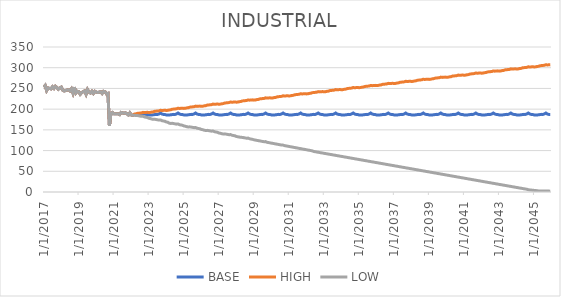
| Category | BASE | HIGH | LOW |
|---|---|---|---|
| 1/1/17 | 253 | 253 | 253 |
| 2/1/17 | 257 | 257 | 257 |
| 3/1/17 | 245 | 245 | 245 |
| 4/1/17 | 251 | 251 | 251 |
| 5/1/17 | 250 | 250 | 250 |
| 6/1/17 | 249 | 249 | 249 |
| 7/1/17 | 254 | 254 | 254 |
| 8/1/17 | 250 | 250 | 250 |
| 9/1/17 | 255 | 255 | 255 |
| 10/1/17 | 252 | 252 | 252 |
| 11/1/17 | 248 | 248 | 248 |
| 12/1/17 | 251 | 251 | 251 |
| 1/1/18 | 253 | 253 | 253 |
| 2/1/18 | 246 | 246 | 246 |
| 3/1/18 | 244 | 244 | 244 |
| 4/1/18 | 245 | 245 | 245 |
| 5/1/18 | 246 | 246 | 246 |
| 6/1/18 | 247 | 247 | 247 |
| 7/1/18 | 244 | 244 | 244 |
| 8/1/18 | 249 | 249 | 249 |
| 9/1/18 | 239 | 239 | 239 |
| 10/1/18 | 253 | 253 | 253 |
| 11/1/18 | 239 | 239 | 239 |
| 12/1/18 | 243.091 | 243.091 | 243.091 |
| 1/1/19 | 242 | 242 | 242 |
| 2/1/19 | 236 | 236 | 236 |
| 3/1/19 | 240 | 240 | 240 |
| 4/1/19 | 242 | 242 | 242 |
| 5/1/19 | 244 | 244 | 244 |
| 6/1/19 | 236 | 236 | 236 |
| 7/1/19 | 247 | 247 | 247 |
| 8/1/19 | 241 | 241 | 241 |
| 9/1/19 | 239 | 239 | 239 |
| 10/1/19 | 243 | 243 | 243 |
| 11/1/19 | 238 | 238 | 238 |
| 12/1/19 | 243 | 243 | 243 |
| 1/1/20 | 241 | 241 | 241 |
| 2/1/20 | 240 | 240 | 240 |
| 3/1/20 | 241 | 241 | 241 |
| 4/1/20 | 242 | 242 | 242 |
| 5/1/20 | 238 | 238 | 238 |
| 6/1/20 | 243 | 243 | 243 |
| 7/1/20 | 242 | 242 | 242 |
| 8/1/20 | 237 | 237 | 237 |
| 9/1/20 | 238 | 238 | 238 |
| 10/1/20 | 160 | 160 | 160 |
| 11/1/20 | 190 | 190 | 190 |
| 12/1/20 | 192 | 192 | 192 |
| 1/1/21 | 189 | 189 | 189 |
| 2/1/21 | 189 | 189 | 189 |
| 3/1/21 | 189 | 189 | 189 |
| 4/1/21 | 189 | 189 | 189 |
| 5/1/21 | 187 | 187 | 187 |
| 6/1/21 | 192 | 192 | 192 |
| 7/1/21 | 191 | 191 | 191 |
| 8/1/21 | 190 | 190 | 190 |
| 9/1/21 | 191 | 191 | 191 |
| 10/1/21 | 189 | 189 | 189 |
| 11/1/21 | 186 | 186 | 186 |
| 12/1/21 | 191 | 191 | 191 |
| 1/1/22 | 186 | 186 | 186 |
| 2/1/22 | 185 | 185 | 185 |
| 3/1/22 | 186.764 | 188.014 | 185.097 |
| 4/1/22 | 186.859 | 188.389 | 184.389 |
| 5/1/22 | 186.943 | 189.764 | 184.681 |
| 6/1/22 | 187.372 | 190.139 | 183.972 |
| 7/1/22 | 186.653 | 190.514 | 183.264 |
| 8/1/22 | 188.143 | 190.889 | 182.556 |
| 9/1/22 | 190.713 | 192.264 | 182.847 |
| 10/1/22 | 188.242 | 191.639 | 181.139 |
| 11/1/22 | 187.274 | 192.014 | 180.431 |
| 12/1/22 | 187.211 | 192.389 | 179.722 |
| 1/1/23 | 186.11 | 191.764 | 178.014 |
| 2/1/23 | 186.002 | 192.139 | 177.306 |
| 3/1/23 | 185.862 | 193.014 | 176.097 |
| 4/1/23 | 186.339 | 193.389 | 175.389 |
| 5/1/23 | 186.837 | 194.764 | 175.681 |
| 6/1/23 | 187.345 | 195.139 | 174.972 |
| 7/1/23 | 187.225 | 195.514 | 174.264 |
| 8/1/23 | 188.499 | 195.889 | 173.556 |
| 9/1/23 | 190.638 | 197.264 | 173.847 |
| 10/1/23 | 188.269 | 196.639 | 172.139 |
| 11/1/23 | 187.278 | 197.014 | 171.431 |
| 12/1/23 | 187.029 | 197.389 | 170.722 |
| 1/1/24 | 186.012 | 196.764 | 169.014 |
| 2/1/24 | 185.937 | 197.139 | 168.306 |
| 3/1/24 | 185.869 | 198.014 | 166.139 |
| 4/1/24 | 186.372 | 198.389 | 165.472 |
| 5/1/24 | 186.876 | 199.764 | 165.806 |
| 6/1/24 | 187.379 | 200.139 | 165.139 |
| 7/1/24 | 187.256 | 200.514 | 164.472 |
| 8/1/24 | 188.508 | 200.889 | 163.806 |
| 9/1/24 | 190.634 | 202.264 | 164.139 |
| 10/1/24 | 188.259 | 201.639 | 162.472 |
| 11/1/24 | 187.258 | 202.014 | 161.806 |
| 12/1/24 | 187.006 | 202.389 | 161.139 |
| 1/1/25 | 186.004 | 201.764 | 159.472 |
| 2/1/25 | 185.941 | 202.139 | 158.806 |
| 3/1/25 | 185.879 | 203.014 | 157.639 |
| 4/1/25 | 186.38 | 203.389 | 156.972 |
| 5/1/25 | 186.881 | 204.764 | 157.306 |
| 6/1/25 | 187.381 | 205.139 | 156.639 |
| 7/1/25 | 187.256 | 205.514 | 155.972 |
| 8/1/25 | 188.506 | 205.889 | 155.306 |
| 9/1/25 | 190.631 | 207.264 | 155.639 |
| 10/1/25 | 188.256 | 206.639 | 153.972 |
| 11/1/25 | 187.256 | 207.014 | 153.306 |
| 12/1/25 | 187.006 | 207.389 | 152.639 |
| 1/1/26 | 186.005 | 206.764 | 150.972 |
| 2/1/26 | 185.943 | 207.139 | 150.306 |
| 3/1/26 | 185.881 | 208.014 | 149.139 |
| 4/1/26 | 186.381 | 208.389 | 148.472 |
| 5/1/26 | 186.881 | 209.764 | 148.806 |
| 6/1/26 | 187.381 | 210.139 | 148.139 |
| 7/1/26 | 187.256 | 210.514 | 147.472 |
| 8/1/26 | 188.506 | 210.889 | 146.806 |
| 9/1/26 | 190.631 | 212.264 | 147.139 |
| 10/1/26 | 188.256 | 211.639 | 145.472 |
| 11/1/26 | 187.256 | 212.014 | 144.806 |
| 12/1/26 | 187.006 | 212.389 | 144.139 |
| 1/1/27 | 186.006 | 211.764 | 142.472 |
| 2/1/27 | 185.943 | 212.139 | 141.806 |
| 3/1/27 | 185.881 | 213.014 | 140.639 |
| 4/1/27 | 186.381 | 213.389 | 139.972 |
| 5/1/27 | 186.881 | 214.764 | 140.306 |
| 6/1/27 | 187.381 | 215.139 | 139.639 |
| 7/1/27 | 187.256 | 215.514 | 138.972 |
| 8/1/27 | 188.506 | 215.889 | 138.306 |
| 9/1/27 | 190.631 | 217.264 | 138.639 |
| 10/1/27 | 188.256 | 216.639 | 136.972 |
| 11/1/27 | 187.256 | 217.014 | 136.306 |
| 12/1/27 | 187.006 | 217.389 | 135.639 |
| 1/1/28 | 186.006 | 216.764 | 133.972 |
| 2/1/28 | 185.943 | 217.139 | 133.306 |
| 3/1/28 | 185.881 | 218.014 | 132.639 |
| 4/1/28 | 186.381 | 218.389 | 131.972 |
| 5/1/28 | 186.881 | 219.764 | 131.806 |
| 6/1/28 | 187.381 | 220.139 | 131.139 |
| 7/1/28 | 187.256 | 220.514 | 130.472 |
| 8/1/28 | 188.506 | 220.889 | 129.806 |
| 9/1/28 | 190.631 | 222.264 | 130.139 |
| 10/1/28 | 188.256 | 221.639 | 128.472 |
| 11/1/28 | 187.256 | 222.014 | 127.806 |
| 12/1/28 | 187.006 | 222.389 | 127.139 |
| 1/1/29 | 186.006 | 221.764 | 125.972 |
| 2/1/29 | 185.943 | 222.139 | 125.306 |
| 3/1/29 | 185.881 | 223.014 | 124.639 |
| 4/1/29 | 186.381 | 223.389 | 123.972 |
| 5/1/29 | 186.881 | 224.764 | 123.306 |
| 6/1/29 | 187.381 | 225.139 | 122.639 |
| 7/1/29 | 187.256 | 225.514 | 121.972 |
| 8/1/29 | 188.506 | 225.889 | 121.306 |
| 9/1/29 | 190.631 | 227.264 | 121.639 |
| 10/1/29 | 188.256 | 226.639 | 119.972 |
| 11/1/29 | 187.256 | 227.014 | 119.306 |
| 12/1/29 | 187.006 | 227.389 | 118.639 |
| 1/1/30 | 186.006 | 226.764 | 117.972 |
| 2/1/30 | 185.943 | 227.139 | 117.306 |
| 3/1/30 | 185.881 | 228.014 | 116.639 |
| 4/1/30 | 186.381 | 228.389 | 115.972 |
| 5/1/30 | 186.881 | 229.764 | 115.306 |
| 6/1/30 | 187.381 | 230.139 | 114.639 |
| 7/1/30 | 187.256 | 230.514 | 113.972 |
| 8/1/30 | 188.506 | 230.889 | 113.306 |
| 9/1/30 | 190.631 | 232.264 | 113.139 |
| 10/1/30 | 188.256 | 231.639 | 111.972 |
| 11/1/30 | 187.256 | 232.014 | 111.306 |
| 12/1/30 | 187.006 | 232.389 | 110.639 |
| 1/1/31 | 186.006 | 231.764 | 109.972 |
| 2/1/31 | 185.943 | 232.139 | 109.306 |
| 3/1/31 | 185.881 | 233.014 | 108.639 |
| 4/1/31 | 186.381 | 233.389 | 107.972 |
| 5/1/31 | 186.881 | 234.764 | 107.306 |
| 6/1/31 | 187.381 | 235.139 | 106.639 |
| 7/1/31 | 187.256 | 235.514 | 105.972 |
| 8/1/31 | 188.506 | 235.889 | 105.306 |
| 9/1/31 | 190.631 | 237.264 | 104.639 |
| 10/1/31 | 188.256 | 236.639 | 103.972 |
| 11/1/31 | 187.256 | 237.014 | 103.306 |
| 12/1/31 | 187.006 | 237.389 | 102.639 |
| 1/1/32 | 186.006 | 236.764 | 101.972 |
| 2/1/32 | 185.943 | 237.139 | 101.306 |
| 3/1/32 | 185.881 | 238.014 | 100.639 |
| 4/1/32 | 186.381 | 238.389 | 99.972 |
| 5/1/32 | 186.881 | 239.764 | 99.306 |
| 6/1/32 | 187.381 | 240.139 | 97.806 |
| 7/1/32 | 187.256 | 240.514 | 97.181 |
| 8/1/32 | 188.506 | 240.889 | 96.556 |
| 9/1/32 | 190.631 | 242.264 | 95.931 |
| 10/1/32 | 188.256 | 241.639 | 95.306 |
| 11/1/32 | 187.256 | 242.014 | 94.681 |
| 12/1/32 | 187.006 | 242.389 | 94.056 |
| 1/1/33 | 186.006 | 241.764 | 93.431 |
| 2/1/33 | 185.943 | 242.139 | 92.806 |
| 3/1/33 | 185.881 | 243.014 | 92.181 |
| 4/1/33 | 186.381 | 243.389 | 91.556 |
| 5/1/33 | 186.881 | 244.764 | 90.931 |
| 6/1/33 | 187.381 | 245.139 | 90.306 |
| 7/1/33 | 187.256 | 245.514 | 89.681 |
| 8/1/33 | 188.506 | 245.889 | 89.056 |
| 9/1/33 | 190.631 | 247.264 | 88.431 |
| 10/1/33 | 188.256 | 246.639 | 87.806 |
| 11/1/33 | 187.256 | 247.014 | 87.181 |
| 12/1/33 | 187.006 | 247.389 | 86.556 |
| 1/1/34 | 186.006 | 246.764 | 85.931 |
| 2/1/34 | 185.943 | 247.139 | 85.306 |
| 3/1/34 | 185.881 | 248.014 | 84.681 |
| 4/1/34 | 186.381 | 248.389 | 84.056 |
| 5/1/34 | 186.881 | 249.764 | 83.431 |
| 6/1/34 | 187.381 | 250.139 | 82.806 |
| 7/1/34 | 187.256 | 250.514 | 82.181 |
| 8/1/34 | 188.506 | 250.889 | 81.556 |
| 9/1/34 | 190.631 | 252.264 | 80.931 |
| 10/1/34 | 188.256 | 251.639 | 80.306 |
| 11/1/34 | 187.256 | 252.014 | 79.681 |
| 12/1/34 | 187.006 | 252.389 | 79.056 |
| 1/1/35 | 186.006 | 251.764 | 78.431 |
| 2/1/35 | 185.943 | 252.139 | 77.806 |
| 3/1/35 | 185.881 | 253.014 | 77.181 |
| 4/1/35 | 186.381 | 253.389 | 76.556 |
| 5/1/35 | 186.881 | 254.764 | 75.931 |
| 6/1/35 | 187.381 | 255.139 | 75.306 |
| 7/1/35 | 187.256 | 255.514 | 74.681 |
| 8/1/35 | 188.506 | 255.889 | 74.056 |
| 9/1/35 | 190.631 | 257.264 | 73.431 |
| 10/1/35 | 188.256 | 256.639 | 72.806 |
| 11/1/35 | 187.256 | 257.014 | 72.181 |
| 12/1/35 | 187.006 | 257.389 | 71.556 |
| 1/1/36 | 186.006 | 256.764 | 70.931 |
| 2/1/36 | 185.943 | 257.139 | 70.306 |
| 3/1/36 | 185.881 | 258.014 | 69.681 |
| 4/1/36 | 186.381 | 258.389 | 69.056 |
| 5/1/36 | 186.881 | 259.764 | 68.431 |
| 6/1/36 | 187.381 | 260.139 | 67.806 |
| 7/1/36 | 187.256 | 260.514 | 67.181 |
| 8/1/36 | 188.506 | 260.889 | 66.556 |
| 9/1/36 | 190.631 | 262.264 | 65.931 |
| 10/1/36 | 188.256 | 261.639 | 65.306 |
| 11/1/36 | 187.256 | 262.014 | 64.681 |
| 12/1/36 | 187.006 | 262.389 | 64.056 |
| 1/1/37 | 186.006 | 261.764 | 63.431 |
| 2/1/37 | 185.943 | 262.139 | 62.806 |
| 3/1/37 | 185.881 | 263.014 | 62.181 |
| 4/1/37 | 186.381 | 263.389 | 61.556 |
| 5/1/37 | 186.881 | 264.764 | 60.931 |
| 6/1/37 | 187.381 | 265.139 | 60.306 |
| 7/1/37 | 187.256 | 265.514 | 59.681 |
| 8/1/37 | 188.506 | 265.889 | 59.056 |
| 9/1/37 | 190.631 | 267.264 | 58.431 |
| 10/1/37 | 188.256 | 266.639 | 57.806 |
| 11/1/37 | 187.256 | 267.014 | 57.181 |
| 12/1/37 | 187.006 | 267.389 | 56.556 |
| 1/1/38 | 186.006 | 266.764 | 55.931 |
| 2/1/38 | 185.943 | 267.139 | 55.306 |
| 3/1/38 | 185.881 | 268.014 | 54.681 |
| 4/1/38 | 186.381 | 268.389 | 54.056 |
| 5/1/38 | 186.881 | 269.764 | 53.431 |
| 6/1/38 | 187.381 | 270.139 | 52.806 |
| 7/1/38 | 187.256 | 270.514 | 52.181 |
| 8/1/38 | 188.506 | 270.889 | 51.556 |
| 9/1/38 | 190.631 | 272.264 | 50.931 |
| 10/1/38 | 188.256 | 271.639 | 50.306 |
| 11/1/38 | 187.256 | 272.014 | 49.681 |
| 12/1/38 | 187.006 | 272.389 | 49.056 |
| 1/1/39 | 186.006 | 271.764 | 48.431 |
| 2/1/39 | 185.943 | 272.139 | 47.806 |
| 3/1/39 | 185.881 | 273.014 | 47.181 |
| 4/1/39 | 186.381 | 273.389 | 46.556 |
| 5/1/39 | 186.881 | 274.764 | 45.931 |
| 6/1/39 | 187.381 | 275.139 | 45.306 |
| 7/1/39 | 187.256 | 275.514 | 44.681 |
| 8/1/39 | 188.506 | 275.889 | 44.056 |
| 9/1/39 | 190.631 | 277.264 | 43.431 |
| 10/1/39 | 188.256 | 276.639 | 42.806 |
| 11/1/39 | 187.256 | 277.014 | 42.181 |
| 12/1/39 | 187.006 | 277.389 | 41.556 |
| 1/1/40 | 186.006 | 276.764 | 40.931 |
| 2/1/40 | 185.943 | 277.139 | 40.306 |
| 3/1/40 | 185.881 | 278.014 | 39.681 |
| 4/1/40 | 186.381 | 278.389 | 39.056 |
| 5/1/40 | 186.881 | 279.764 | 38.431 |
| 6/1/40 | 187.381 | 280.139 | 37.806 |
| 7/1/40 | 187.256 | 280.514 | 37.181 |
| 8/1/40 | 188.506 | 280.889 | 36.556 |
| 9/1/40 | 190.631 | 282.264 | 35.931 |
| 10/1/40 | 188.256 | 281.639 | 35.306 |
| 11/1/40 | 187.256 | 282.014 | 34.681 |
| 12/1/40 | 187.006 | 282.389 | 34.056 |
| 1/1/41 | 186.006 | 281.764 | 33.431 |
| 2/1/41 | 185.943 | 282.139 | 32.806 |
| 3/1/41 | 185.881 | 283.014 | 32.181 |
| 4/1/41 | 186.381 | 283.389 | 31.556 |
| 5/1/41 | 186.881 | 284.764 | 30.931 |
| 6/1/41 | 187.381 | 285.139 | 30.306 |
| 7/1/41 | 187.256 | 285.514 | 29.681 |
| 8/1/41 | 188.506 | 285.889 | 29.056 |
| 9/1/41 | 190.631 | 287.264 | 28.431 |
| 10/1/41 | 188.256 | 286.639 | 27.806 |
| 11/1/41 | 187.256 | 287.014 | 27.181 |
| 12/1/41 | 187.006 | 287.389 | 26.556 |
| 1/1/42 | 186.006 | 286.764 | 25.931 |
| 2/1/42 | 185.943 | 287.139 | 25.306 |
| 3/1/42 | 185.881 | 288.014 | 24.681 |
| 4/1/42 | 186.381 | 288.389 | 24.056 |
| 5/1/42 | 186.881 | 289.764 | 23.431 |
| 6/1/42 | 187.381 | 290.139 | 22.806 |
| 7/1/42 | 187.256 | 290.514 | 22.181 |
| 8/1/42 | 188.506 | 290.889 | 21.556 |
| 9/1/42 | 190.631 | 292.264 | 20.931 |
| 10/1/42 | 188.256 | 291.639 | 20.306 |
| 11/1/42 | 187.256 | 292.014 | 19.681 |
| 12/1/42 | 187.006 | 292.389 | 19.056 |
| 1/1/43 | 186.006 | 291.764 | 18.431 |
| 2/1/43 | 185.943 | 292.139 | 17.806 |
| 3/1/43 | 185.881 | 293.014 | 17.181 |
| 4/1/43 | 186.381 | 293.389 | 16.556 |
| 5/1/43 | 186.881 | 294.764 | 15.931 |
| 6/1/43 | 187.381 | 295.139 | 15.306 |
| 7/1/43 | 187.256 | 295.514 | 14.681 |
| 8/1/43 | 188.506 | 295.889 | 14.056 |
| 9/1/43 | 190.631 | 297.264 | 13.431 |
| 10/1/43 | 188.256 | 296.639 | 12.806 |
| 11/1/43 | 187.256 | 297.014 | 12.181 |
| 12/1/43 | 187.006 | 297.389 | 11.556 |
| 1/1/44 | 186.006 | 296.764 | 10.931 |
| 2/1/44 | 185.943 | 297.139 | 10.306 |
| 3/1/44 | 185.881 | 298.014 | 9.681 |
| 4/1/44 | 186.381 | 298.389 | 9.056 |
| 5/1/44 | 186.881 | 299.764 | 8.431 |
| 6/1/44 | 187.381 | 300.139 | 7.806 |
| 7/1/44 | 187.256 | 300.514 | 7.181 |
| 8/1/44 | 188.506 | 300.889 | 6.556 |
| 9/1/44 | 190.631 | 302.264 | 5.375 |
| 10/1/44 | 188.256 | 301.639 | 5 |
| 11/1/44 | 187.256 | 302.014 | 4.625 |
| 12/1/44 | 187.006 | 302.389 | 4.25 |
| 1/1/45 | 186.006 | 301.764 | 3.875 |
| 2/1/45 | 185.943 | 302.139 | 3.5 |
| 3/1/45 | 185.881 | 303.014 | 3.125 |
| 4/1/45 | 186.381 | 303.389 | 2.417 |
| 5/1/45 | 186.881 | 304.764 | 2.375 |
| 6/1/45 | 187.381 | 305.139 | 2.333 |
| 7/1/45 | 187.256 | 305.514 | 2.292 |
| 8/1/45 | 188.506 | 305.889 | 2.25 |
| 9/1/45 | 190.631 | 307.264 | 2.208 |
| 10/1/45 | 188.256 | 306.639 | 2.167 |
| 11/1/45 | 187.256 | 307.014 | 2.125 |
| 12/1/45 | 187.006 | 307.389 | 2.083 |